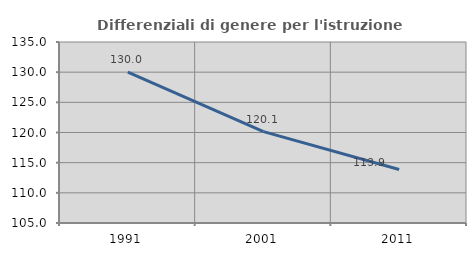
| Category | Differenziali di genere per l'istruzione superiore |
|---|---|
| 1991.0 | 129.998 |
| 2001.0 | 120.146 |
| 2011.0 | 113.856 |